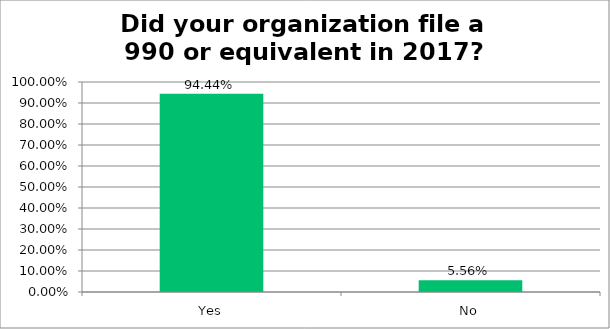
| Category | Responses |
|---|---|
| Yes | 0.944 |
| No | 0.056 |